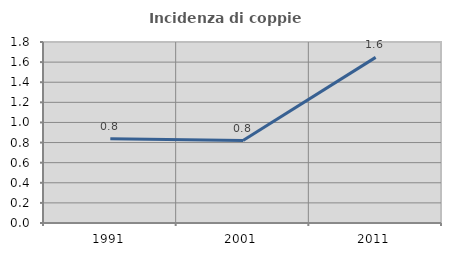
| Category | Incidenza di coppie miste |
|---|---|
| 1991.0 | 0.837 |
| 2001.0 | 0.82 |
| 2011.0 | 1.647 |